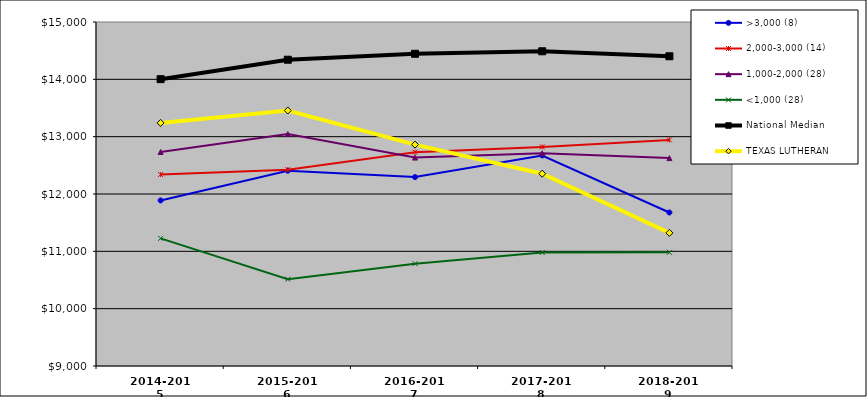
| Category | >3,000 (8) | 2,000-3,000 (14) | 1,000-2,000 (28) | <1,000 (28) | National Median |  TEXAS LUTHERAN  |
|---|---|---|---|---|---|---|
| 2014-2015 | 11887.579 | 12339.336 | 12732.299 | 11226.176 | 14002.887 | 13239.91 |
| 2015-2016 | 12405.381 | 12424.669 | 13045.664 | 10514.671 | 14342.086 | 13456.186 |
| 2016-2017 | 12294.987 | 12728.944 | 12635.352 | 10784.43 | 14445.621 | 12861.172 |
| 2017-2018 | 12672.146 | 12821.792 | 12709.908 | 10979.506 | 14489.448 | 12353.524 |
| 2018-2019 | 11677.448 | 12943.239 | 12626.247 | 10982.391 | 14402.238 | 11322.153 |